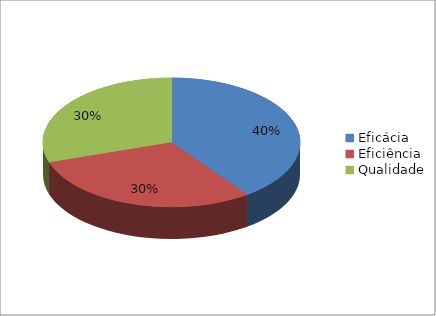
| Category | Series 0 |
|---|---|
| Eficácia | 0.4 |
| Eficiência | 0.3 |
| Qualidade | 0.3 |